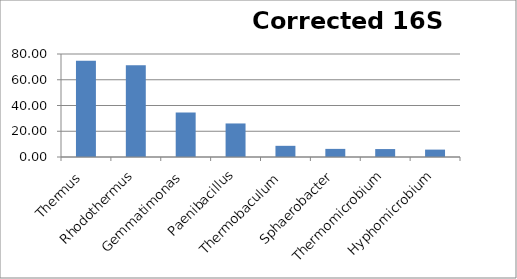
| Category | Series 0 |
|---|---|
| Thermus | 74.739 |
| Rhodothermus | 71.202 |
| Gemmatimonas | 34.5 |
| Paenibacillus | 26.053 |
| Thermobaculum | 8.682 |
| Sphaerobacter | 6.305 |
| Thermomicrobium | 6.171 |
| Hyphomicrobium | 5.742 |